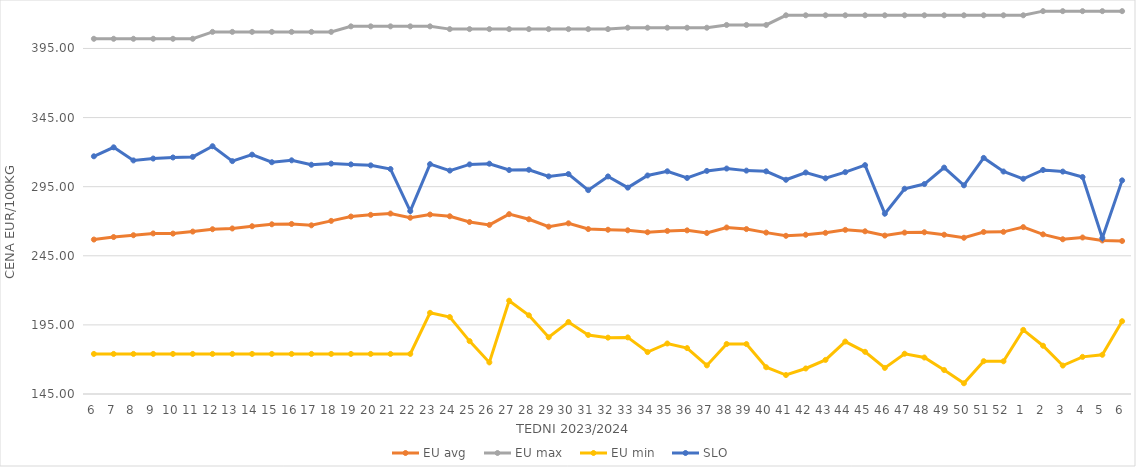
| Category | EU avg | EU max | EU min | SLO |
|---|---|---|---|---|
| 6.0 | 256.75 | 402 | 174 | 316.99 |
| 7.0 | 258.565 | 402 | 174 | 323.47 |
| 8.0 | 259.872 | 402 | 174 | 314 |
| 9.0 | 261.164 | 402 | 174 | 315.35 |
| 10.0 | 261.06 | 402 | 174 | 316.13 |
| 11.0 | 262.513 | 402 | 174 | 316.55 |
| 12.0 | 264.228 | 407 | 174 | 324.27 |
| 13.0 | 264.768 | 407 | 174 | 313.49 |
| 14.0 | 266.385 | 407 | 174 | 318.17 |
| 15.0 | 267.797 | 407 | 174 | 312.7 |
| 16.0 | 268.021 | 407 | 174 | 314.07 |
| 17.0 | 267.041 | 407 | 174 | 310.87 |
| 18.0 | 270.255 | 407 | 174 | 311.69 |
| 19.0 | 273.406 | 411 | 174 | 311.13 |
| 20.0 | 274.631 | 411 | 174 | 310.42 |
| 21.0 | 275.561 | 411 | 174 | 307.76 |
| 22.0 | 272.542 | 411 | 174 | 277.34 |
| 23.0 | 274.85 | 411 | 203.728 | 311.28 |
| 24.0 | 273.59 | 409 | 200.686 | 306.64 |
| 25.0 | 269.439 | 409 | 183.275 | 311.1 |
| 26.0 | 267.345 | 409 | 167.858 | 311.62 |
| 27.0 | 275.123 | 409 | 212.506 | 307.04 |
| 28.0 | 271.42 | 409 | 201.945 | 307.23 |
| 29.0 | 266.08 | 409 | 186.018 | 302.45 |
| 30.0 | 268.49 | 409 | 197.093 | 304.14 |
| 31.0 | 264.334 | 409 | 187.684 | 292.49 |
| 32.0 | 263.844 | 409 | 185.774 | 302.41 |
| 33.0 | 263.441 | 410 | 185.951 | 294.3 |
| 34.0 | 262.028 | 410 | 175.332 | 303.1 |
| 35.0 | 262.997 | 410 | 181.543 | 306.13 |
| 36.0 | 263.389 | 410 | 178.207 | 301.32 |
| 37.0 | 261.486 | 410 | 165.697 | 306.4 |
| 38.0 | 265.47 | 412 | 181.159 | 308.12 |
| 39.0 | 264.316 | 412 | 181.124 | 306.62 |
| 40.0 | 261.774 | 412 | 164.37 | 306.1 |
| 41.0 | 259.456 | 419 | 158.728 | 300 |
| 42.0 | 260.21 | 419 | 163.464 | 305.24 |
| 43.0 | 261.605 | 419 | 169.66 | 301.07 |
| 44.0 | 263.758 | 419 | 182.925 | 305.52 |
| 45.0 | 262.714 | 419 | 175.524 | 310.58 |
| 46.0 | 259.625 | 419 | 163.882 | 275.46 |
| 47.0 | 261.772 | 419 | 174.136 | 293.51 |
| 48.0 | 262.018 | 419 | 171.4 | 296.9 |
| 49.0 | 260.246 | 419 | 162.336 | 308.8 |
| 50.0 | 258.042 | 419 | 152.762 | 295.97 |
| 51.0 | 262.231 | 419 | 168.739 | 315.82 |
| 52.0 | 262.325 | 419 | 168.659 | 305.97 |
| 1.0 | 265.728 | 419 | 191.406 | 300.71 |
| 2.0 | 260.513 | 422 | 179.926 | 307.09 |
| 3.0 | 256.954 | 422 | 165.575 | 305.92 |
| 4.0 | 258.235 | 422 | 171.865 | 301.97 |
| 5.0 | 256.088 | 422 | 173.378 | 257.83 |
| 6.0 | 255.714 | 422 | 197.669 | 299.57 |